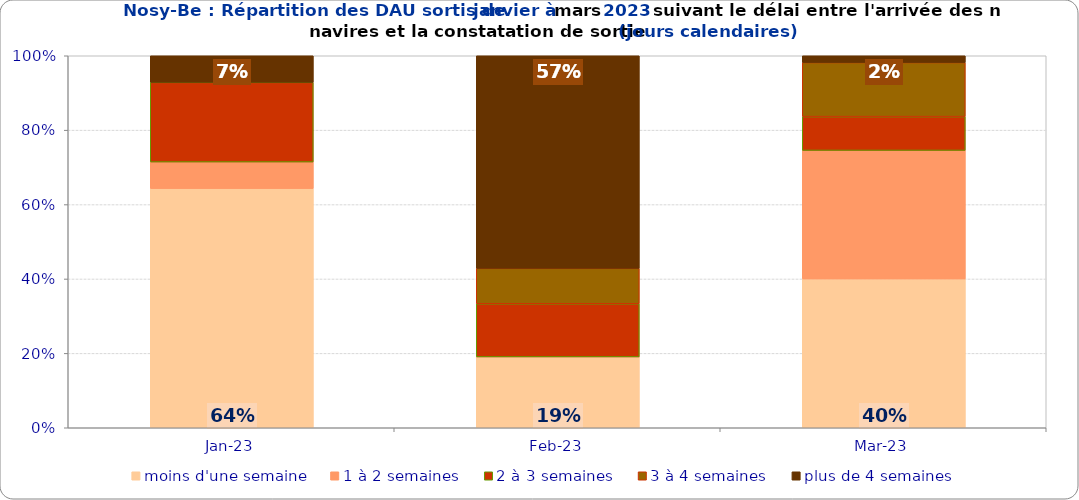
| Category | moins d'une semaine | 1 à 2 semaines | 2 à 3 semaines | 3 à 4 semaines | plus de 4 semaines |
|---|---|---|---|---|---|
| 2023-01-01 | 0.643 | 0.071 | 0.214 | 0 | 0.071 |
| 2023-02-01 | 0.19 | 0 | 0.143 | 0.095 | 0.571 |
| 2023-03-01 | 0.4 | 0.345 | 0.091 | 0.145 | 0.018 |